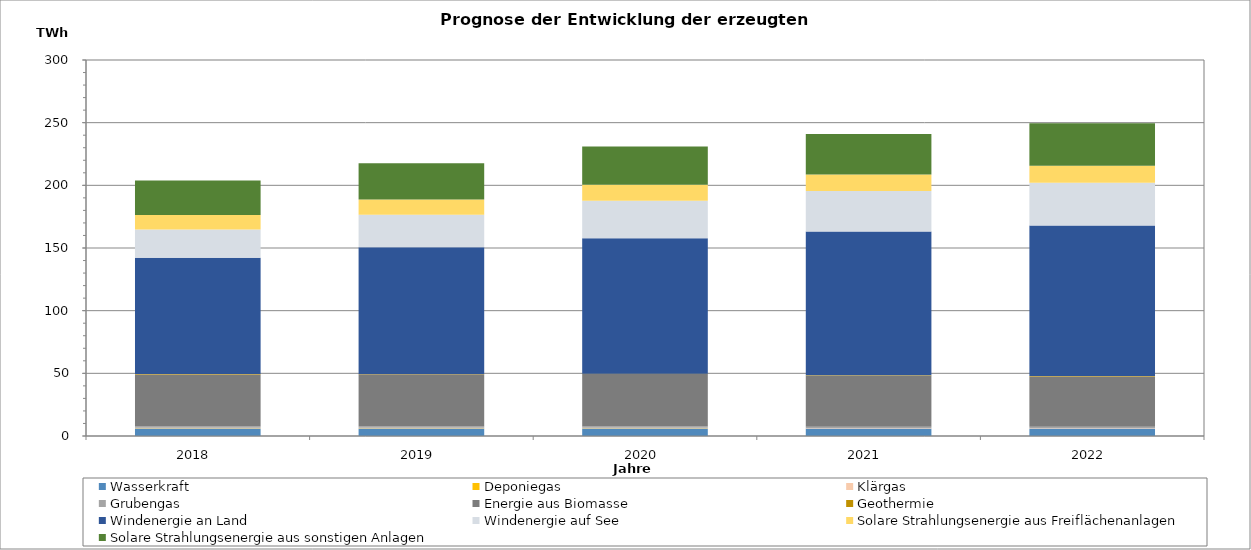
| Category | Wasserkraft | Deponiegas | Klärgas | Grubengas | Energie aus Biomasse | Geothermie | Windenergie an Land | Windenergie auf See | Solare Strahlungsenergie aus Freiflächenanlagen | Solare Strahlungsenergie aus sonstigen Anlagen |
|---|---|---|---|---|---|---|---|---|---|---|
| 2018.0 | 5923.796 | 258.934 | 416.296 | 1002.515 | 41554.489 | 257.28 | 92724.077 | 22564.406 | 11558.243 | 27615.372 |
| 2019.0 | 5934.422 | 236.419 | 417.946 | 989.274 | 41608.453 | 323.068 | 101183.211 | 25814.058 | 12143.278 | 29008.314 |
| 2020.0 | 5964.966 | 216.438 | 420.743 | 978.875 | 41796.205 | 345.449 | 108059.925 | 29839.459 | 12779.651 | 30646.046 |
| 2021.0 | 5955.674 | 104.295 | 421.245 | 963.284 | 40702.431 | 375.733 | 114669.353 | 32193.617 | 13270.87 | 32309.175 |
| 2022.0 | 5966.3 | 77.156 | 422.894 | 950.531 | 40024.262 | 377.831 | 120035.194 | 34174.899 | 13670.011 | 33854.064 |